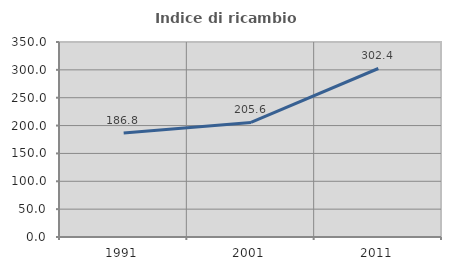
| Category | Indice di ricambio occupazionale  |
|---|---|
| 1991.0 | 186.765 |
| 2001.0 | 205.556 |
| 2011.0 | 302.439 |